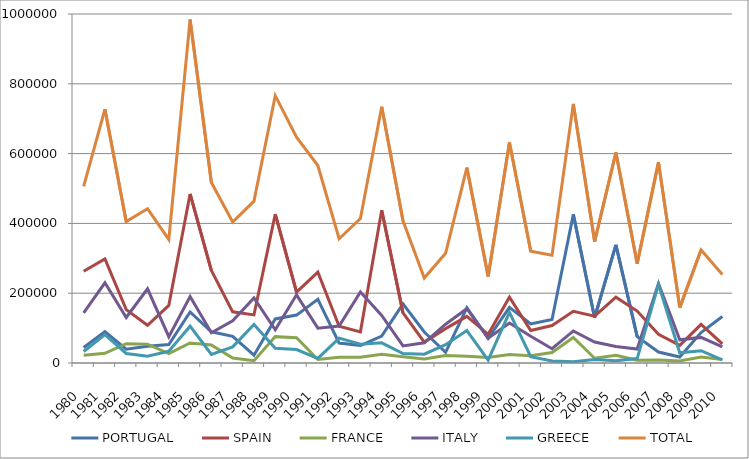
| Category | PORTUGAL | SPAIN | FRANCE | ITALY | GREECE | TOTAL |
|---|---|---|---|---|---|---|
| 1980.0 | 44251 | 263017 | 22176 | 143919 | 32965 | 506328 |
| 1981.0 | 89798 | 298288 | 27711 | 229850 | 81417 | 727064 |
| 1982.0 | 39556 | 152903 | 55145 | 130456 | 27372 | 405432 |
| 1983.0 | 47811 | 108100 | 53729 | 212678 | 19613 | 441931 |
| 1984.0 | 52710 | 165119 | 27202 | 75272 | 33655 | 353958 |
| 1985.0 | 146254 | 484476 | 57368 | 190640 | 105450 | 984188 |
| 1986.0 | 89522 | 264887 | 51860 | 86420 | 24514 | 517203 |
| 1987.0 | 76269 | 146662 | 14108 | 120697 | 46315 | 404051 |
| 1988.0 | 22434 | 137734 | 6701 | 186405 | 110501 | 463775 |
| 1989.0 | 126237 | 426693 | 75566 | 95161 | 42363 | 766020 |
| 1990.0 | 137252 | 203032 | 72625 | 195319 | 38594 | 646822 |
| 1991.0 | 182486 | 260318 | 10130 | 99860 | 13046 | 565840 |
| 1992.0 | 57011 | 105277 | 16593 | 105692 | 71410 | 355983 |
| 1993.0 | 49963 | 89267 | 16698 | 203749 | 54049 | 413726 |
| 1994.0 | 77323 | 437635 | 24995 | 136334 | 57908 | 734195 |
| 1995.0 | 169612 | 143484 | 18137 | 48884 | 27202 | 407319 |
| 1996.0 | 88867 | 59814 | 11400 | 57988 | 25310 | 243379 |
| 1997.0 | 30535 | 98503 | 21581 | 111230 | 52373 | 314222 |
| 1998.0 | 158369 | 133643 | 19282 | 155553 | 92901 | 559748 |
| 1999.0 | 70613 | 82217 | 15906 | 71117 | 8289 | 248142 |
| 2000.0 | 159605 | 188586 | 24078 | 114648 | 145033 | 631950 |
| 2001.0 | 111850 | 93297 | 20642 | 76427 | 18221 | 320437 |
| 2002.0 | 124411 | 107464 | 30160 | 40791 | 6013 | 308839 |
| 2003.0 | 425726 | 148172 | 73278 | 91805 | 3517 | 742498 |
| 2004.0 | 129539 | 134193 | 13711 | 60176 | 10267 | 347886 |
| 2005.0 | 338262 | 188697 | 22135 | 47575 | 6437 | 603106 |
| 2006.0 | 75510 | 148827 | 7844 | 39946 | 12661 | 284788 |
| 2007.0 | 31450 | 82048 | 8570 | 227729 | 225734 | 575531 |
| 2008.0 | 17244 | 50321 | 6001 | 66329 | 29152 | 158621 |
| 2009.0 | 87416 | 110783 | 17000 | 73355 | 35342 | 323896 |
| 2010.0 | 133090 | 54770 | 10300 | 46537 | 8967 | 253664 |